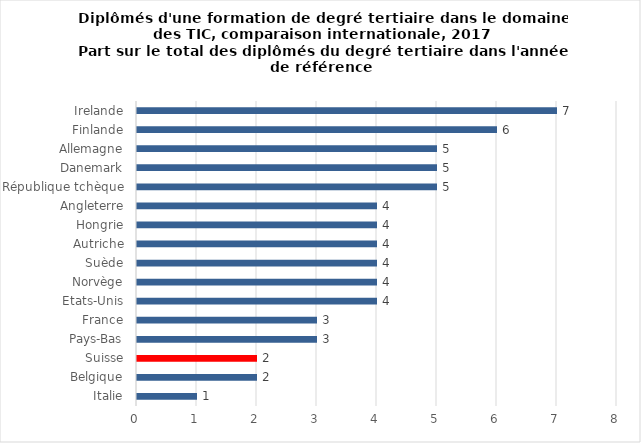
| Category | 2017 |
|---|---|
| Italie | 1 |
| Belgique | 2 |
| Suisse | 2 |
| Pays-Bas | 3 |
| France | 3 |
| Etats-Unis | 4 |
| Norvège | 4 |
| Suède | 4 |
| Autriche | 4 |
| Hongrie | 4 |
| Angleterre | 4 |
| République tchèque | 5 |
| Danemark | 5 |
| Allemagne | 5 |
| Finlande | 6 |
| Irelande | 7 |